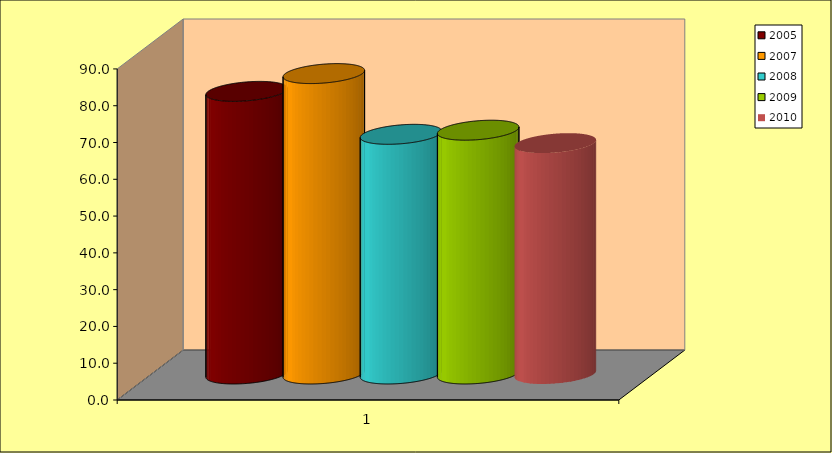
| Category | 2005 | 2007 | 2008 | 2009 | 2010 |
|---|---|---|---|---|---|
| 0 | 76.829 | 81.667 | 65.156 | 66.275 | 62.766 |